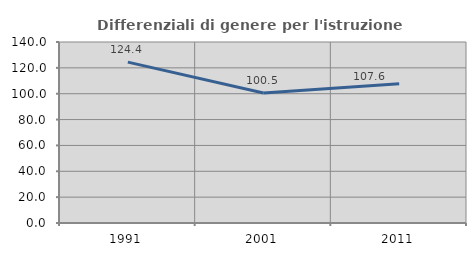
| Category | Differenziali di genere per l'istruzione superiore |
|---|---|
| 1991.0 | 124.426 |
| 2001.0 | 100.523 |
| 2011.0 | 107.64 |